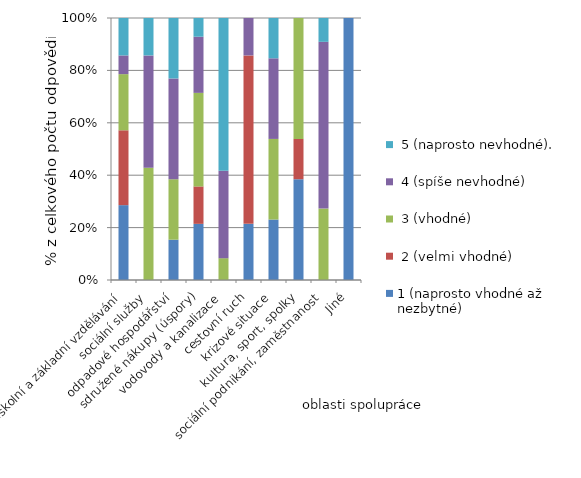
| Category | 1 (naprosto vhodné až nezbytné) |  2 (velmi vhodné) |  3 (vhodné) |  4 (spíše nevhodné) |  5 (naprosto nevhodné).  |
|---|---|---|---|---|---|
| předškolní a základní vzdělávání | 4 | 4 | 3 | 1 | 2 |
| sociální služby | 0 | 0 | 6 | 6 | 2 |
| odpadové hospodářství | 2 | 0 | 3 | 5 | 3 |
| sdružené nákupy (úspory) | 3 | 2 | 5 | 3 | 1 |
| vodovody a kanalizace | 0 | 0 | 1 | 4 | 7 |
| cestovní ruch | 3 | 9 | 0 | 2 | 0 |
| krizové situace | 3 | 0 | 4 | 4 | 2 |
| kultura, sport, spolky | 5 | 2 | 6 | 0 | 0 |
| sociální podnikání, zaměstnanost | 0 | 0 | 3 | 7 | 1 |
| Jiné | 2 | 0 | 0 | 0 | 0 |